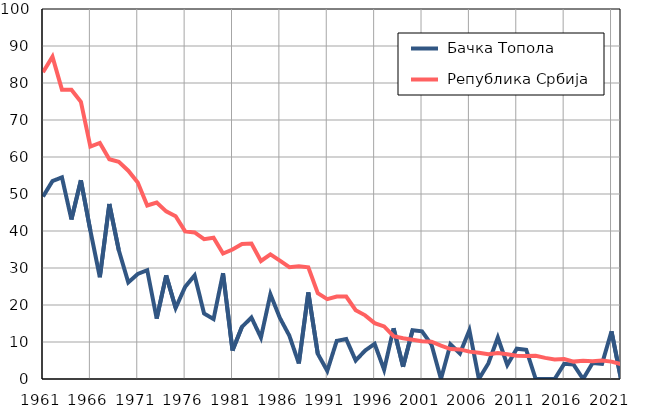
| Category |  Бачка Топола |  Република Србија |
|---|---|---|
| 1961.0 | 49.3 | 82.9 |
| 1962.0 | 53.5 | 87.1 |
| 1963.0 | 54.5 | 78.2 |
| 1964.0 | 43.1 | 78.2 |
| 1965.0 | 53.7 | 74.9 |
| 1966.0 | 40.1 | 62.8 |
| 1967.0 | 27.5 | 63.8 |
| 1968.0 | 47.3 | 59.4 |
| 1969.0 | 34.8 | 58.7 |
| 1970.0 | 26.1 | 56.3 |
| 1971.0 | 28.4 | 53.1 |
| 1972.0 | 29.4 | 46.9 |
| 1973.0 | 16.3 | 47.7 |
| 1974.0 | 28 | 45.3 |
| 1975.0 | 19.2 | 44 |
| 1976.0 | 24.9 | 39.9 |
| 1977.0 | 28 | 39.6 |
| 1978.0 | 17.7 | 37.8 |
| 1979.0 | 16.2 | 38.2 |
| 1980.0 | 28.6 | 33.9 |
| 1981.0 | 7.7 | 35 |
| 1982.0 | 14.1 | 36.5 |
| 1983.0 | 16.6 | 36.6 |
| 1984.0 | 11.2 | 31.9 |
| 1985.0 | 22.9 | 33.7 |
| 1986.0 | 16.5 | 32 |
| 1987.0 | 11.7 | 30.2 |
| 1988.0 | 4.2 | 30.5 |
| 1989.0 | 23.4 | 30.2 |
| 1990.0 | 6.8 | 23.2 |
| 1991.0 | 2.2 | 21.6 |
| 1992.0 | 10.3 | 22.3 |
| 1993.0 | 10.8 | 22.3 |
| 1994.0 | 5 | 18.6 |
| 1995.0 | 7.7 | 17.2 |
| 1996.0 | 9.5 | 15.1 |
| 1997.0 | 2.5 | 14.2 |
| 1998.0 | 13.7 | 11.6 |
| 1999.0 | 3.3 | 11 |
| 2000.0 | 13.2 | 10.6 |
| 2001.0 | 12.9 | 10.2 |
| 2002.0 | 9.3 | 10.1 |
| 2003.0 | 0 | 9 |
| 2004.0 | 9.4 | 8.1 |
| 2005.0 | 6.9 | 8 |
| 2006.0 | 13.2 | 7.4 |
| 2007.0 | 0 | 7.1 |
| 2008.0 | 4.2 | 6.7 |
| 2009.0 | 11.2 | 7 |
| 2010.0 | 3.8 | 6.7 |
| 2011.0 | 8.2 | 6.3 |
| 2012.0 | 7.9 | 6.2 |
| 2013.0 | 0 | 6.3 |
| 2014.0 | 0 | 5.7 |
| 2015.0 | 0 | 5.3 |
| 2016.0 | 4.1 | 5.4 |
| 2017.0 | 3.9 | 4.7 |
| 2018.0 | 0 | 4.9 |
| 2019.0 | 4.3 | 4.8 |
| 2020.0 | 4.1 | 5 |
| 2021.0 | 12.9 | 4.7 |
| 2022.0 | 0 | 4 |